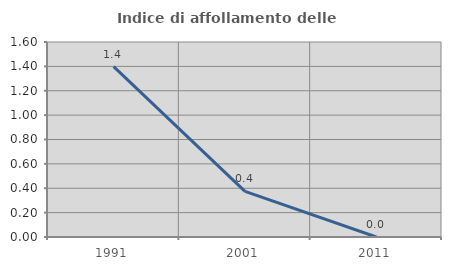
| Category | Indice di affollamento delle abitazioni  |
|---|---|
| 1991.0 | 1.399 |
| 2001.0 | 0.375 |
| 2011.0 | 0 |